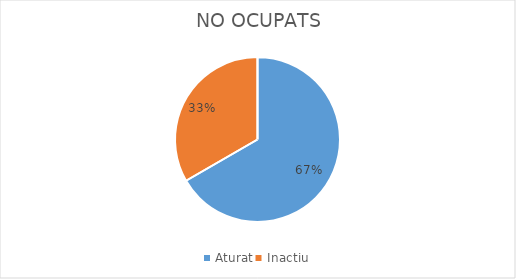
| Category | Series 0 |
|---|---|
| Aturat | 4 |
| Inactiu | 2 |